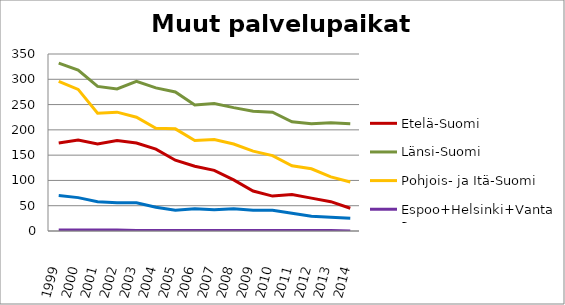
| Category | Etelä-Suomi | Länsi-Suomi | Pohjois- ja Itä-Suomi | Espoo+Helsinki+Vantaa | Muu Uusimaa |
|---|---|---|---|---|---|
| 1999.0 | 174 | 332 | 296 | 2 | 70 |
| 2000.0 | 180 | 318 | 280 | 2 | 66 |
| 2001.0 | 172 | 286 | 233 | 2 | 58 |
| 2002.0 | 179 | 281 | 235 | 2 | 56 |
| 2003.0 | 174 | 296 | 225 | 1 | 56 |
| 2004.0 | 162 | 283 | 203 | 1 | 47 |
| 2005.0 | 140 | 275 | 202 | 1 | 41 |
| 2006.0 | 128 | 249 | 179 | 1 | 44 |
| 2007.0 | 120 | 252 | 181 | 1 | 42 |
| 2008.0 | 101 | 244 | 172 | 1 | 44 |
| 2009.0 | 79 | 237 | 158 | 1 | 41 |
| 2010.0 | 69 | 235 | 149 | 1 | 41 |
| 2011.0 | 72 | 216 | 129 | 1 | 35 |
| 2012.0 | 65 | 212 | 123 | 1 | 29 |
| 2013.0 | 58 | 214 | 107 | 1 | 27 |
| 2014.0 | 45 | 212 | 97 | 0 | 25 |